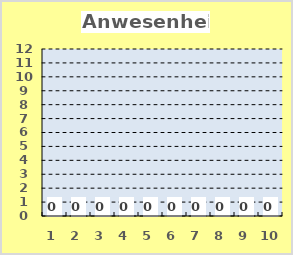
| Category | Series 0 |
|---|---|
| 1.0 | 0 |
| 2.0 | 0 |
| 3.0 | 0 |
| 4.0 | 0 |
| 5.0 | 0 |
| 6.0 | 0 |
| 7.0 | 0 |
| 8.0 | 0 |
| 9.0 | 0 |
| 10.0 | 0 |